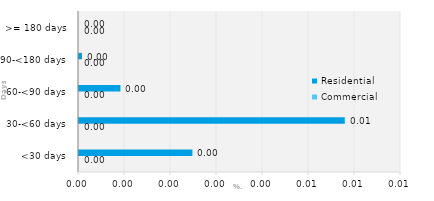
| Category | Commercial | Residential |
|---|---|---|
| <30 days | 0 | 0.002 |
| 30-<60 days | 0 | 0.006 |
| 60-<90 days | 0 | 0.001 |
| 90-<180 days | 0 | 0 |
| >= 180 days | 0 | 0 |